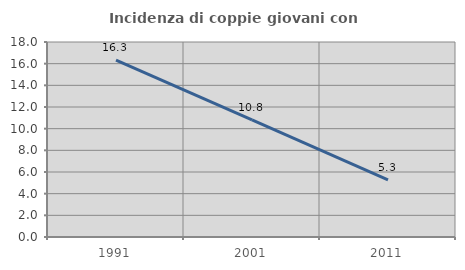
| Category | Incidenza di coppie giovani con figli |
|---|---|
| 1991.0 | 16.337 |
| 2001.0 | 10.803 |
| 2011.0 | 5.28 |